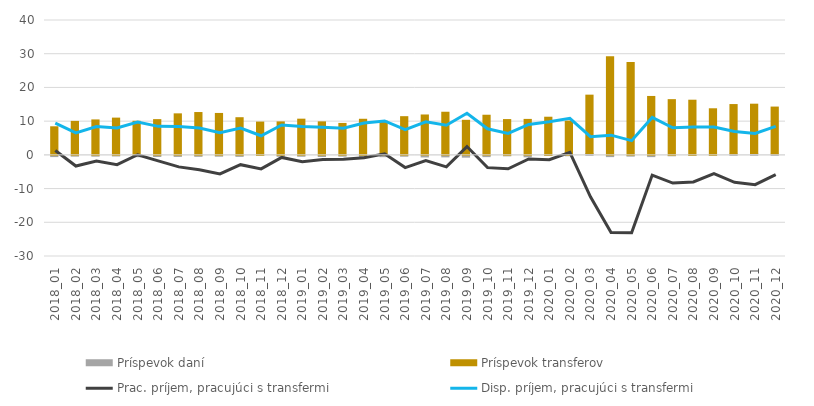
| Category | Príspevok daní | Príspevok transferov |
|---|---|---|
| 0 | -0.365 | 8.473 |
| 1 | -0.228 | 10.076 |
| 2 | -0.235 | 10.512 |
| 3 | -0.178 | 11.048 |
| 4 | -0.403 | 10.109 |
| 5 | -0.34 | 10.599 |
| 6 | -0.316 | 12.312 |
| 7 | -0.287 | 12.703 |
| 8 | -0.248 | 12.431 |
| 9 | -0.303 | 11.166 |
| 10 | -0.035 | 9.87 |
| 11 | -0.279 | 9.924 |
| 12 | -0.262 | 10.733 |
| 13 | -0.347 | 9.936 |
| 14 | -0.234 | 9.471 |
| 15 | -0.407 | 10.705 |
| 16 | -0.387 | 10.134 |
| 17 | -0.254 | 11.475 |
| 18 | -0.472 | 11.978 |
| 19 | -0.448 | 12.79 |
| 20 | -0.534 | 10.394 |
| 21 | -0.373 | 11.9 |
| 22 | -0.143 | 10.614 |
| 23 | -0.428 | 10.665 |
| 24 | -0.029 | 11.312 |
| 25 | -0.113 | 10.168 |
| 26 | 0.55 | 17.307 |
| 27 | -0.37 | 29.268 |
| 28 | -0.227 | 27.552 |
| 29 | -0.373 | 17.47 |
| 30 | -0.124 | 16.522 |
| 31 | -0.038 | 16.358 |
| 32 | 0.02 | 13.797 |
| 33 | 0.412 | 14.656 |
| 34 | 0.542 | 14.635 |
| 35 | 0.362 | 13.96 |